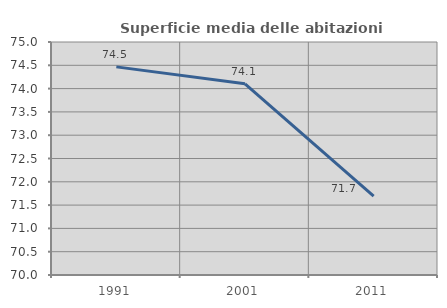
| Category | Superficie media delle abitazioni occupate |
|---|---|
| 1991.0 | 74.466 |
| 2001.0 | 74.103 |
| 2011.0 | 71.693 |